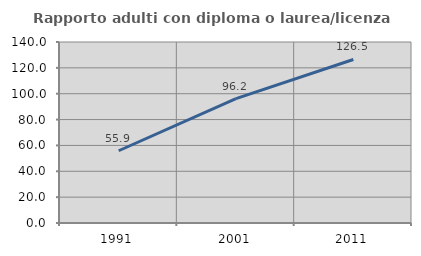
| Category | Rapporto adulti con diploma o laurea/licenza media  |
|---|---|
| 1991.0 | 55.882 |
| 2001.0 | 96.226 |
| 2011.0 | 126.471 |